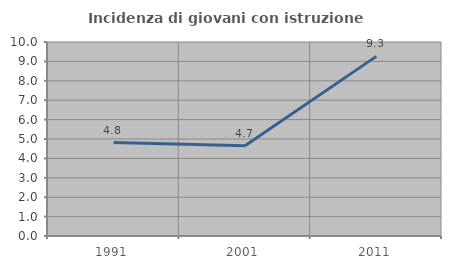
| Category | Incidenza di giovani con istruzione universitaria |
|---|---|
| 1991.0 | 4.819 |
| 2001.0 | 4.651 |
| 2011.0 | 9.259 |